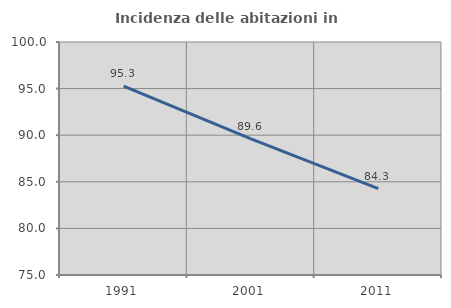
| Category | Incidenza delle abitazioni in proprietà  |
|---|---|
| 1991.0 | 95.276 |
| 2001.0 | 89.6 |
| 2011.0 | 84.259 |